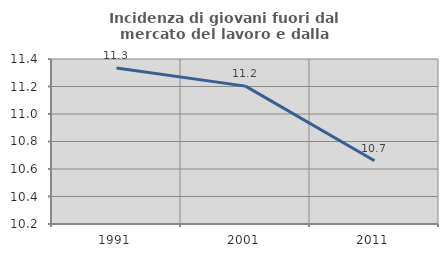
| Category | Incidenza di giovani fuori dal mercato del lavoro e dalla formazione  |
|---|---|
| 1991.0 | 11.335 |
| 2001.0 | 11.203 |
| 2011.0 | 10.66 |